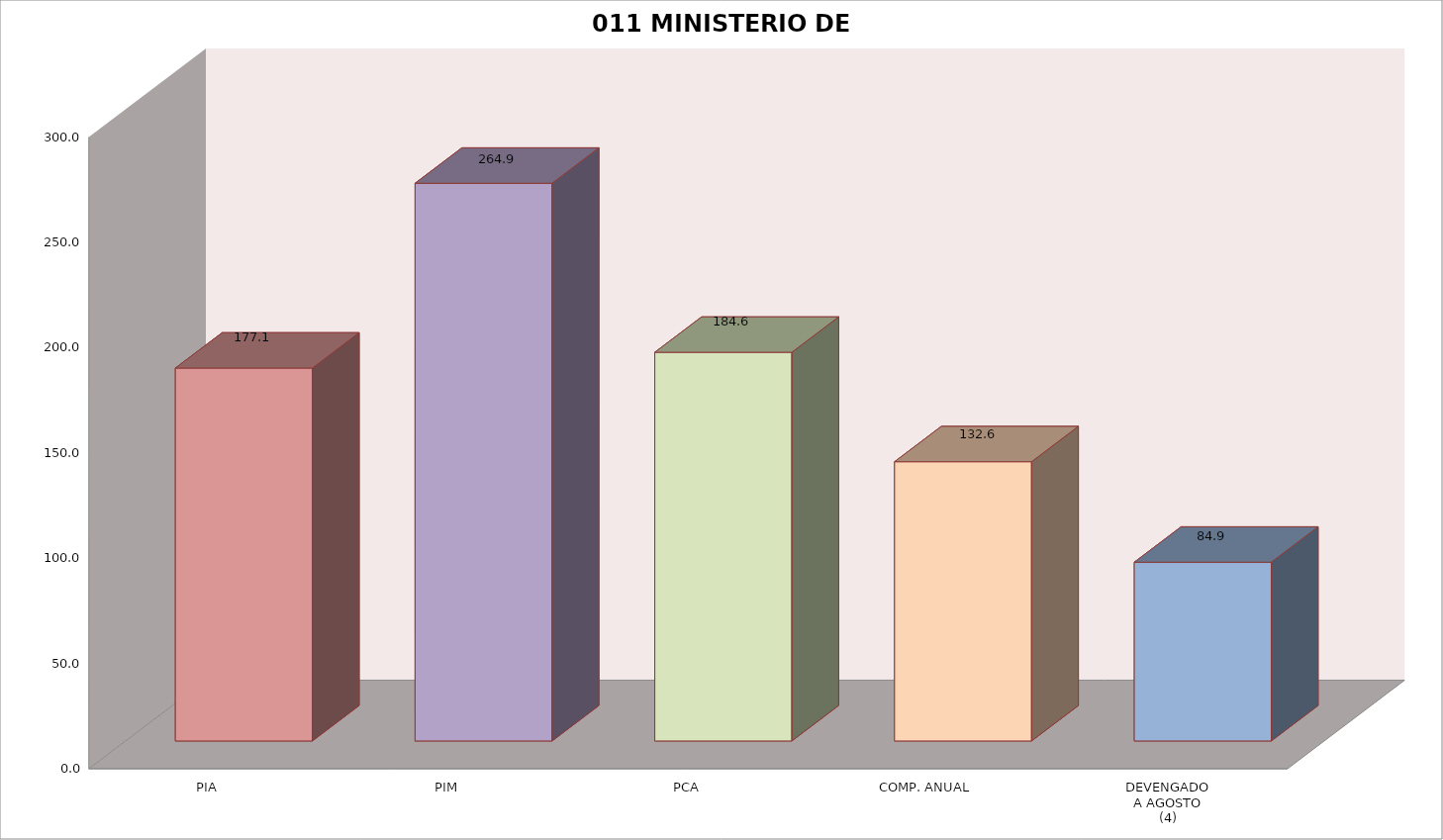
| Category | 011 MINISTERIO DE SALUD |
|---|---|
| PIA | 177.09 |
| PIM | 264.874 |
| PCA | 184.596 |
| COMP. ANUAL | 132.611 |
| DEVENGADO
A AGOSTO
(4) | 84.896 |